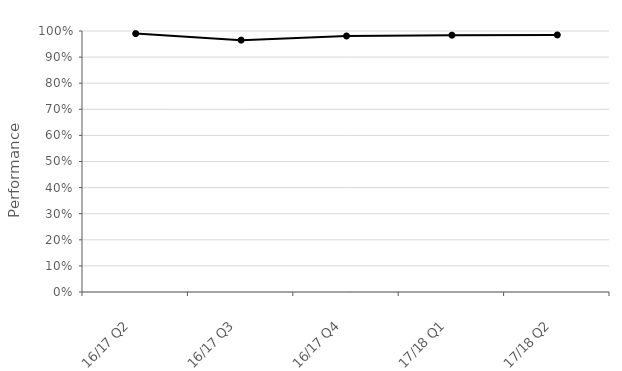
| Category | National |
|---|---|
| 16/17 Q2 | 0.99 |
| 16/17 Q3 | 0.965 |
| 16/17 Q4 | 0.981 |
| 17/18 Q1 | 0.984 |
| 17/18 Q2 | 0.985 |